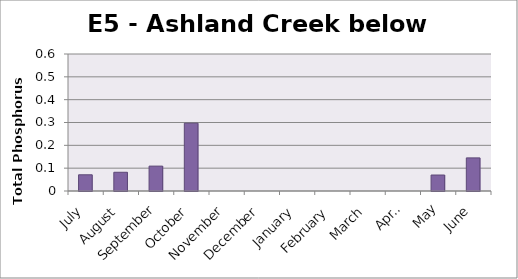
| Category | Phosphorus (mg/L) |
|---|---|
| July | 0.071 |
| August | 0.082 |
| September | 0.109 |
| October | 0.297 |
| November | 0 |
| December | 0 |
| January | 0 |
| February | 0 |
| March | 0 |
| April | 0 |
| May | 0.07 |
| June | 0.145 |